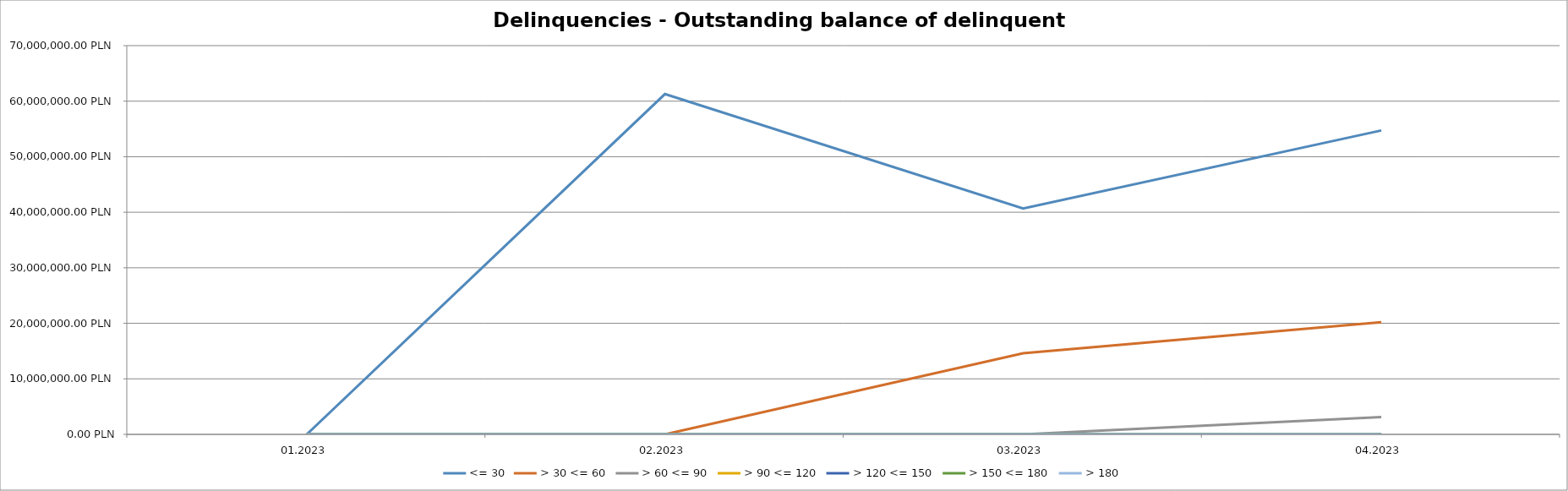
| Category | <= 30 | > 30 <= 60 | > 60 <= 90 | > 90 <= 120 | > 120 <= 150 | > 150 <= 180 | > 180 |
|---|---|---|---|---|---|---|---|
| 01.2023 | 0 | 0 | 0 | 0 | 0 | 0 | 0 |
| 02.2023 | 61279332.52 | 0 | 0 | 0 | 0 | 0 | 0 |
| 03.2023 | 40663789.15 | 14592814.21 | 0 | 0 | 0 | 0 | 0 |
| 04.2023 | 54729258.98 | 20207986.71 | 3105470.81 | 0 | 0 | 0 | 0 |